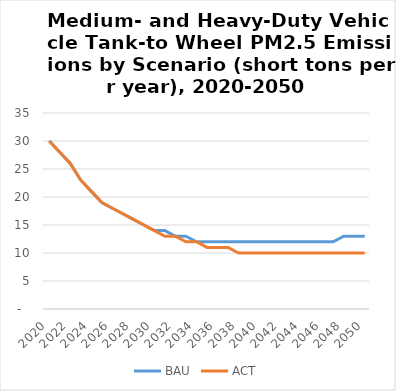
| Category | BAU | ACT |
|---|---|---|
| 2020.0 | 30 | 30 |
| 2021.0 | 28 | 28 |
| 2022.0 | 26 | 26 |
| 2023.0 | 23 | 23 |
| 2024.0 | 21 | 21 |
| 2025.0 | 19 | 19 |
| 2026.0 | 18 | 18 |
| 2027.0 | 17 | 17 |
| 2028.0 | 16 | 16 |
| 2029.0 | 15 | 15 |
| 2030.0 | 14 | 14 |
| 2031.0 | 14 | 13 |
| 2032.0 | 13 | 13 |
| 2033.0 | 13 | 12 |
| 2034.0 | 12 | 12 |
| 2035.0 | 12 | 11 |
| 2036.0 | 12 | 11 |
| 2037.0 | 12 | 11 |
| 2038.0 | 12 | 10 |
| 2039.0 | 12 | 10 |
| 2040.0 | 12 | 10 |
| 2041.0 | 12 | 10 |
| 2042.0 | 12 | 10 |
| 2043.0 | 12 | 10 |
| 2044.0 | 12 | 10 |
| 2045.0 | 12 | 10 |
| 2046.0 | 12 | 10 |
| 2047.0 | 12 | 10 |
| 2048.0 | 13 | 10 |
| 2049.0 | 13 | 10 |
| 2050.0 | 13 | 10 |